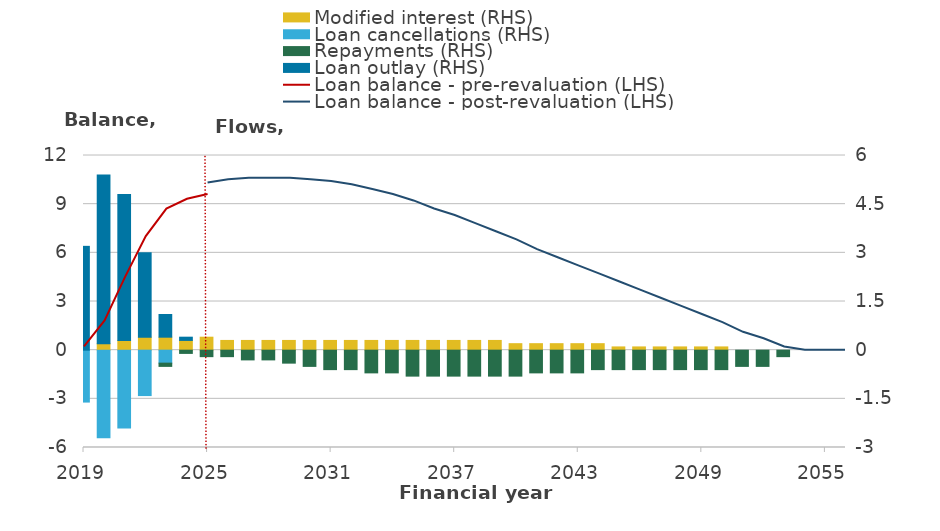
| Category | Modified interest (RHS) | Loan cancellations (RHS) | Repayments (RHS) | Loan outlay (RHS) |
|---|---|---|---|---|
| 2017-18 | 0 | -1.6 | 0 | 3.2 |
| 2018-19 | 0.2 | -2.7 | 0 | 5.2 |
| 2019-20 | 0.3 | -2.4 | 0 | 4.5 |
| 2020-21 | 0.4 | -1.4 | 0 | 2.6 |
| 2021-22 | 0.4 | -0.4 | -0.1 | 0.7 |
| 2022-23 | 0.3 | 0 | -0.1 | 0.1 |
| 2023-24 | 0.4 | 0 | -0.2 | 0 |
| 2024-25 | 0.3 | 0 | -0.2 | 0 |
| 2025-26 | 0.3 | 0 | -0.3 | 0 |
| 2026-27 | 0.3 | 0 | -0.3 | 0 |
| 2027-28 | 0.3 | 0 | -0.4 | 0 |
| 2028-29 | 0.3 | 0 | -0.5 | 0 |
| 2029-30 | 0.3 | 0 | -0.6 | 0 |
| 2030-31 | 0.3 | 0 | -0.6 | 0 |
| 2031-32 | 0.3 | 0 | -0.7 | 0 |
| 2032-33 | 0.3 | 0 | -0.7 | 0 |
| 2033-34 | 0.3 | 0 | -0.8 | 0 |
| 2034-35 | 0.3 | 0 | -0.8 | 0 |
| 2035-36 | 0.3 | 0 | -0.8 | 0 |
| 2036-37 | 0.3 | 0 | -0.8 | 0 |
| 2037-38 | 0.3 | 0 | -0.8 | 0 |
| 2038-39 | 0.2 | 0 | -0.8 | 0 |
| 2039-40 | 0.2 | 0 | -0.7 | 0 |
| 2040-41 | 0.2 | 0 | -0.7 | 0 |
| 2041-42 | 0.2 | 0 | -0.7 | 0 |
| 2042-43 | 0.2 | 0 | -0.6 | 0 |
| 2043-44 | 0.1 | 0 | -0.6 | 0 |
| 2044-45 | 0.1 | 0 | -0.6 | 0 |
| 2045-46 | 0.1 | 0 | -0.6 | 0 |
| 2046-47 | 0.1 | 0 | -0.6 | 0 |
| 2047-48 | 0.1 | 0 | -0.6 | 0 |
| 2048-49 | 0.1 | 0 | -0.6 | 0 |
| 2049-50 | 0 | 0 | -0.5 | 0 |
| 2050-51 | 0 | 0 | -0.5 | 0 |
| 2051-52 | 0 | 0 | -0.2 | 0 |
| 2052-53 | 0 | 0 | 0 | 0 |
| 2053-54 | 0 | 0 | 0 | 0 |
| 2054-55 | 0 | 0 | 0 | 0 |